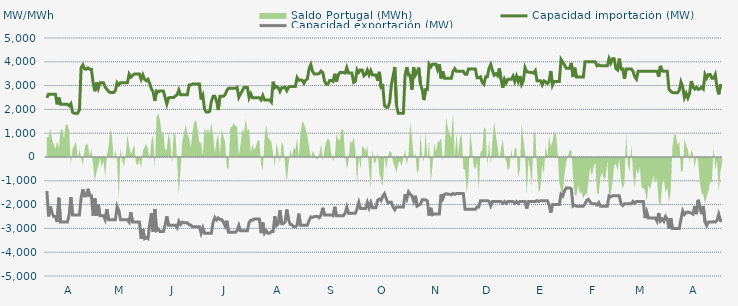
| Category | Capacidad importación (MW) | Capacidad exportación (MW) |
|---|---|---|
| 0 | 2487.5 | -1427.083 |
| 1900-01-01 | 2639.583 | -2495.833 |
| 1900-01-02 | 2633.333 | -2079.167 |
| 1900-01-03 | 2633.333 | -2350 |
| 1900-01-04 | 2633.333 | -2500 |
| 1900-01-05 | 2633.333 | -2500 |
| 1900-01-06 | 2212.5 | -2733.333 |
| 1900-01-07 | 2495.833 | -1712.5 |
| 1900-01-08 | 2212.5 | -2733.333 |
| 1900-01-09 | 2212.5 | -2725 |
| 1900-01-10 | 2212.5 | -2733.333 |
| 1900-01-11 | 2212.5 | -2733.333 |
| 1900-01-12 | 2212.5 | -2733.333 |
| 1900-01-13 | 2150 | -2433.333 |
| 1900-01-14 | 2241.667 | -1683.333 |
| 1900-01-15 | 1883.333 | -2433.333 |
| 1900-01-16 | 1837.5 | -2433.333 |
| 1900-01-17 | 1837.5 | -2433.333 |
| 1900-01-18 | 1837.5 | -2433.333 |
| 1900-01-19 | 1987.5 | -2433.333 |
| 1900-01-20 | 3754.167 | -1700 |
| 1900-01-21 | 3870.833 | -1362.5 |
| 1900-01-22 | 3704.167 | -1637.5 |
| 1900-01-23 | 3687.5 | -1633.333 |
| 1900-01-24 | 3743.75 | -1333.333 |
| 1900-01-25 | 3687.5 | -1633.333 |
| 1900-01-26 | 3687.5 | -1633.333 |
| 1900-01-27 | 3125 | -2466.667 |
| 1900-01-28 | 2762.5 | -1741.667 |
| 1900-01-29 | 3125 | -2466.667 |
| 1900-01-30 | 2881.25 | -1979.167 |
| 1900-01-31 | 3125 | -2466.667 |
| 1900-02-01 | 3125 | -2466.667 |
| 1900-02-02 | 3125 | -2466.667 |
| 1900-02-03 | 2941.667 | -2633.333 |
| 1900-02-04 | 2852.083 | -2187.5 |
| 1900-02-05 | 2752.083 | -2633.333 |
| 1900-02-06 | 2712.5 | -2633.333 |
| 1900-02-07 | 2712.5 | -2633.333 |
| 1900-02-08 | 2712.5 | -2633.333 |
| 1900-02-09 | 2795.833 | -2633.333 |
| 1900-02-10 | 3125 | -2079.583 |
| 1900-02-11 | 3029.167 | -2250 |
| 1900-02-12 | 3125 | -2633.333 |
| 1900-02-13 | 3125 | -2633.333 |
| 1900-02-14 | 3125 | -2633.333 |
| 1900-02-15 | 3125 | -2633.333 |
| 1900-02-16 | 3125 | -2633.333 |
| 1900-02-17 | 3483.333 | -2733.333 |
| 1900-02-18 | 3358.333 | -2320.833 |
| 1900-02-19 | 3429.167 | -2733.333 |
| 1900-02-20 | 3483.333 | -2733.333 |
| 1900-02-21 | 3483.333 | -2733.333 |
| 1900-02-22 | 3483.333 | -2733.333 |
| 1900-02-23 | 3483.333 | -2733.333 |
| 1900-02-24 | 3266.667 | -3433.333 |
| 1900-02-25 | 3454.167 | -3020.833 |
| 1900-02-26 | 3266.667 | -3433.333 |
| 1900-02-27 | 3204.167 | -3391.667 |
| 1900-02-28 | 3266.667 | -3433.333 |
| 1900-02-28 | 3083.333 | -2816.667 |
| 1900-03-01 | 2866.667 | -2362.5 |
| 1900-03-02 | 2737.5 | -3133.333 |
| 1900-03-03 | 2358.333 | -2183.333 |
| 1900-03-04 | 2775 | -3085.417 |
| 1900-03-05 | 2733.333 | -3029.167 |
| 1900-03-06 | 2775 | -3133.333 |
| 1900-03-07 | 2775 | -3133.333 |
| 1900-03-08 | 2775 | -3133.333 |
| 1900-03-09 | 2500 | -2866.667 |
| 1900-03-10 | 2225 | -2491.667 |
| 1900-03-11 | 2481.25 | -2866.667 |
| 1900-03-12 | 2500 | -2866.667 |
| 1900-03-13 | 2500 | -2866.667 |
| 1900-03-14 | 2500 | -2866.667 |
| 1900-03-15 | 2562.5 | -2866.667 |
| 1900-03-16 | 2612.5 | -2966.667 |
| 1900-03-17 | 2818.75 | -2704.167 |
| 1900-03-18 | 2612.5 | -2833.333 |
| 1900-03-19 | 2612.5 | -2737.5 |
| 1900-03-20 | 2612.5 | -2766.667 |
| 1900-03-21 | 2612.5 | -2766.667 |
| 1900-03-22 | 2612.5 | -2766.667 |
| 1900-03-23 | 3025 | -2850 |
| 1900-03-24 | 3029.167 | -2858.333 |
| 1900-03-25 | 3066.667 | -2933.333 |
| 1900-03-26 | 3066.667 | -2933.333 |
| 1900-03-27 | 3066.667 | -2933.333 |
| 1900-03-28 | 3066.667 | -2933.333 |
| 1900-03-29 | 3066.667 | -2933.333 |
| 1900-03-30 | 2416.667 | -3200 |
| 1900-03-31 | 2585.417 | -2975 |
| 1900-04-01 | 2012.5 | -3200 |
| 1900-04-02 | 1887.5 | -3200 |
| 1900-04-03 | 1887.5 | -3200 |
| 1900-04-04 | 1920.833 | -3200 |
| 1900-04-05 | 2333.333 | -3200 |
| 1900-04-06 | 2550 | -2733.333 |
| 1900-04-07 | 2550 | -2545.833 |
| 1900-04-08 | 2362.5 | -2645.833 |
| 1900-04-09 | 1975 | -2558.333 |
| 1900-04-10 | 2550 | -2629.167 |
| 1900-04-11 | 2550 | -2629.167 |
| 1900-04-12 | 2550 | -2729.167 |
| 1900-04-13 | 2616.667 | -2895.833 |
| 1900-04-14 | 2793.75 | -2679.167 |
| 1900-04-15 | 2887.5 | -3166.667 |
| 1900-04-16 | 2887.5 | -3166.667 |
| 1900-04-17 | 2887.5 | -3166.667 |
| 1900-04-18 | 2887.5 | -3166.667 |
| 1900-04-19 | 2887.5 | -3166.667 |
| 1900-04-20 | 2925 | -3100 |
| 1900-04-21 | 2512.5 | -2875 |
| 1900-04-22 | 2658.333 | -3100 |
| 1900-04-23 | 2779.167 | -3100 |
| 1900-04-24 | 2925 | -3100 |
| 1900-04-25 | 2925 | -3100 |
| 1900-04-26 | 2925 | -3100 |
| 1900-04-27 | 2487.5 | -2758.333 |
| 1900-04-28 | 2656.25 | -2658.333 |
| 1900-04-29 | 2487.5 | -2654.167 |
| 1900-04-30 | 2487.5 | -2600 |
| 1900-05-01 | 2487.5 | -2600 |
| 1900-05-02 | 2487.5 | -2600 |
| 1900-05-03 | 2487.5 | -2600 |
| 1900-05-04 | 2400 | -3200 |
| 1900-05-05 | 2583.333 | -2750 |
| 1900-05-06 | 2400 | -3200 |
| 1900-05-07 | 2400 | -3100 |
| 1900-05-08 | 2400 | -3200 |
| 1900-05-09 | 2400 | -3200 |
| 1900-05-10 | 2308.333 | -3133.333 |
| 1900-05-11 | 3162.5 | -3133.333 |
| 1900-05-12 | 2910.417 | -2495.833 |
| 1900-05-13 | 2962.5 | -2875 |
| 1900-05-14 | 2912.5 | -2800 |
| 1900-05-15 | 2752.083 | -2237.5 |
| 1900-05-16 | 2912.5 | -2800 |
| 1900-05-17 | 2912.5 | -2800 |
| 1900-05-18 | 2933.333 | -2733.333 |
| 1900-05-19 | 2787.5 | -2208.333 |
| 1900-05-20 | 2929.167 | -2633.333 |
| 1900-05-21 | 2962.5 | -2829.167 |
| 1900-05-22 | 2962.5 | -2850 |
| 1900-05-23 | 2962.5 | -2933.333 |
| 1900-05-24 | 2962.5 | -2933.333 |
| 1900-05-25 | 3337.5 | -2866.667 |
| 1900-05-26 | 3222.917 | -2379.167 |
| 1900-05-27 | 3237.5 | -2866.667 |
| 1900-05-28 | 3225 | -2866.667 |
| 1900-05-29 | 3095.833 | -2866.667 |
| 1900-05-30 | 3225 | -2866.667 |
| 1900-05-31 | 3281.25 | -2866.667 |
| 1900-06-01 | 3700 | -2666.667 |
| 1900-06-02 | 3883.333 | -2516.667 |
| 1900-06-03 | 3600 | -2537.5 |
| 1900-06-04 | 3487.5 | -2500 |
| 1900-06-05 | 3487.5 | -2500 |
| 1900-06-06 | 3487.5 | -2500 |
| 1900-06-07 | 3518.75 | -2550 |
| 1900-06-08 | 3612.5 | -2433.333 |
| 1900-06-09 | 3543.75 | -2133.333 |
| 1900-06-10 | 3193.75 | -2433.333 |
| 1900-06-11 | 3060.417 | -2433.333 |
| 1900-06-12 | 3059.167 | -2433.333 |
| 1900-06-13 | 3212.5 | -2433.333 |
| 1900-06-14 | 3212.5 | -2433.333 |
| 1900-06-15 | 3175 | -2466.667 |
| 1900-06-16 | 3495.833 | -2091.667 |
| 1900-06-17 | 3166.667 | -2466.667 |
| 1900-06-18 | 3454.167 | -2466.667 |
| 1900-06-19 | 3550 | -2466.667 |
| 1900-06-20 | 3550 | -2466.667 |
| 1900-06-21 | 3550 | -2466.667 |
| 1900-06-22 | 3525 | -2366.667 |
| 1900-06-23 | 3754.167 | -2104.167 |
| 1900-06-24 | 3525 | -2366.667 |
| 1900-06-25 | 3525 | -2366.667 |
| 1900-06-26 | 3525 | -2366.667 |
| 1900-06-27 | 3135 | -2366.667 |
| 1900-06-28 | 3175 | -2366.667 |
| 1900-06-29 | 3666.667 | -2166.667 |
| 1900-06-30 | 3558.333 | -1904.167 |
| 1900-07-01 | 3658.333 | -2166.667 |
| 1900-07-02 | 3650 | -2166.667 |
| 1900-07-03 | 3412.5 | -2166.667 |
| 1900-07-04 | 3475 | -2166.667 |
| 1900-07-05 | 3650 | -1904.167 |
| 1900-07-06 | 3450 | -2133.333 |
| 1900-07-07 | 3633.333 | -1912.5 |
| 1900-07-08 | 3450 | -2133.333 |
| 1900-07-09 | 3450 | -2133.333 |
| 1900-07-10 | 3450 | -2133.333 |
| 1900-07-11 | 3210.417 | -1816.667 |
| 1900-07-12 | 3577.083 | -1766.667 |
| 1900-07-13 | 2937.5 | -1833.333 |
| 1900-07-14 | 2985.417 | -1645.833 |
| 1900-07-15 | 2162.5 | -1541.667 |
| 1900-07-16 | 2087.5 | -1745.833 |
| 1900-07-17 | 2087.5 | -1929.167 |
| 1900-07-18 | 2295.833 | -1900 |
| 1900-07-19 | 3025 | -1900 |
| 1900-07-20 | 3395.833 | -2100 |
| 1900-07-21 | 3781.25 | -2212.5 |
| 1900-07-22 | 2170.833 | -2100 |
| 1900-07-23 | 1837.5 | -2100 |
| 1900-07-24 | 1837.5 | -2100 |
| 1900-07-25 | 1837.5 | -2100 |
| 1900-07-26 | 1837.5 | -2100 |
| 1900-07-27 | 3433.333 | -1566.667 |
| 1900-07-28 | 3776 | -1760 |
| 1900-07-29 | 3433.333 | -1466.667 |
| 1900-07-30 | 3433.333 | -1566.667 |
| 1900-07-31 | 2829.167 | -1633.333 |
| 1900-08-01 | 3766.667 | -1854.167 |
| 1900-08-02 | 3433.333 | -1629.167 |
| 1900-08-03 | 3562.5 | -2066.667 |
| 1900-08-04 | 3754.167 | -2029.167 |
| 1900-08-05 | 3064.583 | -1979.167 |
| 1900-08-06 | 2833.333 | -1800 |
| 1900-08-07 | 2391.667 | -1800 |
| 1900-08-08 | 2833.333 | -1800 |
| 1900-08-09 | 2833.333 | -1841.667 |
| 1900-08-10 | 3900 | -2466.667 |
| 1900-08-11 | 3787.5 | -2133.333 |
| 1900-08-12 | 3900 | -2429.167 |
| 1900-08-13 | 3900 | -2400 |
| 1900-08-14 | 3900 | -2400 |
| 1900-08-15 | 3668.75 | -2400 |
| 1900-08-16 | 3900 | -2400 |
| 1900-08-17 | 3304.167 | -1566.667 |
| 1900-08-18 | 3595.833 | -1754.167 |
| 1900-08-19 | 3304.167 | -1566.667 |
| 1900-08-20 | 3304.167 | -1541.667 |
| 1900-08-21 | 3304.167 | -1566.667 |
| 1900-08-22 | 3304.167 | -1566.667 |
| 1900-08-23 | 3304.167 | -1591.667 |
| 1900-08-24 | 3600 | -1533.333 |
| 1900-08-25 | 3712.5 | -1570.833 |
| 1900-08-26 | 3600 | -1533.333 |
| 1900-08-27 | 3600 | -1533.333 |
| 1900-08-28 | 3600 | -1533.333 |
| 1900-08-29 | 3600 | -1533.333 |
| 1900-08-30 | 3600 | -1533.333 |
| 1900-08-31 | 3475 | -2200 |
| 1900-09-01 | 3475 | -2200 |
| 1900-09-02 | 3700 | -2200 |
| 1900-09-03 | 3700 | -2200 |
| 1900-09-04 | 3700 | -2200 |
| 1900-09-05 | 3700 | -2200 |
| 1900-09-06 | 3700 | -2200 |
| 1900-09-07 | 3329.167 | -2095.833 |
| 1900-09-08 | 3329.167 | -2095.833 |
| 1900-09-09 | 3366.667 | -1833.333 |
| 1900-09-10 | 3141.667 | -1833.333 |
| 1900-09-11 | 3058.333 | -1833.333 |
| 1900-09-12 | 3366.667 | -1833.333 |
| 1900-09-13 | 3366.667 | -1833.333 |
| 1900-09-14 | 3725 | -1866.667 |
| 1900-09-15 | 3883.333 | -2054.167 |
| 1900-09-16 | 3631.25 | -1866.667 |
| 1900-09-17 | 3435.417 | -1866.667 |
| 1900-09-18 | 3495.833 | -1866.667 |
| 1900-09-19 | 3416.667 | -1866.667 |
| 1900-09-20 | 3725 | -1866.667 |
| 1900-09-21 | 3266.667 | -1866.667 |
| 1900-09-22 | 2912.5 | -1941.667 |
| 1900-09-23 | 3266.667 | -1866.667 |
| 1900-09-24 | 3116.667 | -1941.667 |
| 1900-09-25 | 3266.667 | -1866.667 |
| 1900-09-26 | 3266.667 | -1866.667 |
| 1900-09-27 | 3266.667 | -1866.667 |
| 1900-09-28 | 3400 | -1866.667 |
| 1900-09-29 | 3175 | -1941.667 |
| 1900-09-30 | 3400 | -1866.667 |
| 1900-10-01 | 3175 | -1941.667 |
| 1900-10-02 | 3400 | -1866.667 |
| 1900-10-03 | 3047.917 | -1866.667 |
| 1900-10-04 | 3200 | -1866.667 |
| 1900-10-05 | 3754.167 | -1866.667 |
| 1900-10-06 | 3581.25 | -2166.667 |
| 1900-10-07 | 3566.667 | -1866.667 |
| 1900-10-08 | 3554.167 | -1866.667 |
| 1900-10-09 | 3554.167 | -1866.667 |
| 1900-10-10 | 3525 | -1866.667 |
| 1900-10-11 | 3629.167 | -1866.667 |
| 1900-10-12 | 3200 | -1833.333 |
| 1900-10-13 | 3200 | -1870.833 |
| 1900-10-14 | 3200 | -1833.333 |
| 1900-10-15 | 3031.25 | -1833.333 |
| 1900-10-16 | 3200 | -1833.333 |
| 1900-10-17 | 3162.5 | -1833.333 |
| 1900-10-18 | 3083.333 | -1833.333 |
| 1900-10-19 | 3175 | -2000 |
| 1900-10-20 | 3608.333 | -2337.5 |
| 1900-10-21 | 3016.667 | -2000 |
| 1900-10-22 | 3175 | -2000 |
| 1900-10-23 | 3175 | -2000 |
| 1900-10-24 | 3175 | -2000 |
| 1900-10-25 | 3175 | -2000 |
| 1900-10-26 | 4100 | -1566.667 |
| 1900-10-27 | 3987.5 | -1641.667 |
| 1900-10-28 | 3864.583 | -1425 |
| 1900-10-29 | 3733.333 | -1300 |
| 1900-10-30 | 3733.333 | -1300 |
| 1900-10-31 | 3733.333 | -1300 |
| 1900-11-01 | 3952.083 | -1341.667 |
| 1900-11-02 | 3362.5 | -2066.667 |
| 1900-11-03 | 3752.083 | -2029.167 |
| 1900-11-04 | 3362.5 | -2066.667 |
| 1900-11-05 | 3362.5 | -2066.667 |
| 1900-11-06 | 3362.5 | -2066.667 |
| 1900-11-07 | 3362.5 | -2066.667 |
| 1900-11-08 | 3362.5 | -2066.667 |
| 1900-11-09 | 4000 | -1966.667 |
| 1900-11-10 | 4000 | -1816.667 |
| 1900-11-11 | 4000 | -1779.167 |
| 1900-11-12 | 4000 | -1891.667 |
| 1900-11-13 | 4000 | -1966.667 |
| 1900-11-14 | 4000 | -1966.667 |
| 1900-11-15 | 4000 | -1966.667 |
| 1900-11-16 | 3829.167 | -2016.667 |
| 1900-11-17 | 3870.833 | -1916.667 |
| 1900-11-18 | 3829.167 | -2066.667 |
| 1900-11-19 | 3829.167 | -2066.667 |
| 1900-11-20 | 3829.167 | -2066.667 |
| 1900-11-21 | 3829.167 | -2066.667 |
| 1900-11-22 | 3829.167 | -2066.667 |
| 1900-11-23 | 4133.333 | -1633.333 |
| 1900-11-24 | 3945.833 | -1670.833 |
| 1900-11-25 | 4133.333 | -1633.333 |
| 1900-11-26 | 4133.333 | -1633.333 |
| 1900-11-27 | 3716.667 | -1633.333 |
| 1900-11-28 | 3658.333 | -1633.333 |
| 1900-11-29 | 4133.333 | -1633.333 |
| 1900-11-30 | 3700 | -1966.667 |
| 1900-12-01 | 3700 | -2041.667 |
| 1900-12-02 | 3283.333 | -1966.667 |
| 1900-12-03 | 3700 | -1966.667 |
| 1900-12-04 | 3700 | -1966.667 |
| 1900-12-05 | 3700 | -1966.667 |
| 1900-12-06 | 3700 | -1966.667 |
| 1900-12-07 | 3600 | -1866.667 |
| 1900-12-08 | 3375 | -1941.667 |
| 1900-12-09 | 3270.833 | -1866.667 |
| 1900-12-10 | 3600 | -1866.667 |
| 1900-12-11 | 3600 | -1866.667 |
| 1900-12-12 | 3600 | -1866.667 |
| 1900-12-13 | 3600 | -1866.667 |
| 1900-12-14 | 3600 | -2566.667 |
| 1900-12-15 | 3600 | -2304.167 |
| 1900-12-16 | 3600 | -2566.667 |
| 1900-12-17 | 3600 | -2566.667 |
| 1900-12-18 | 3600 | -2566.667 |
| 1900-12-19 | 3600 | -2566.667 |
| 1900-12-20 | 3600 | -2566.667 |
| 1900-12-21 | 3600 | -2700 |
| 1900-12-22 | 3375 | -2362.5 |
| 1900-12-23 | 3829.167 | -2687.5 |
| 1900-12-24 | 3616.667 | -2600 |
| 1900-12-25 | 3600 | -2700 |
| 1900-12-26 | 3600 | -2500 |
| 1900-12-27 | 3600 | -2612.5 |
| 1900-12-28 | 2833.333 | -3000 |
| 1900-12-29 | 2760.87 | -2565.217 |
| 1900-12-30 | 2708.333 | -3000 |
| 1900-12-31 | 2700 | -3000 |
| 1901-01-01 | 2700 | -3000 |
| 1901-01-02 | 2700 | -3000 |
| 1901-01-03 | 2800 | -3000 |
| 1901-01-04 | 3150 | -2600 |
| 1901-01-05 | 2945.833 | -2262.5 |
| 1901-01-06 | 2495.833 | -2412.5 |
| 1901-01-07 | 2675 | -2333.333 |
| 1901-01-08 | 2479.167 | -2308.333 |
| 1901-01-09 | 2675 | -2333.333 |
| 1901-01-10 | 3191.667 | -2358.333 |
| 1901-01-11 | 2933.333 | -2400 |
| 1901-01-12 | 2858.333 | -2062.5 |
| 1901-01-13 | 2933.333 | -2400 |
| 1901-01-14 | 2839.583 | -1800 |
| 1901-01-15 | 2864.583 | -2091.667 |
| 1901-01-16 | 2933.333 | -2400 |
| 1901-01-17 | 2858.333 | -2062.5 |
| 1901-01-18 | 3466.667 | -2733.333 |
| 1901-01-19 | 3316.667 | -2883.333 |
| 1901-01-20 | 3466.667 | -2733.333 |
| 1901-01-21 | 3466.667 | -2733.333 |
| 1901-01-22 | 3310.417 | -2733.333 |
| 1901-01-23 | 3306.25 | -2716.667 |
| 1901-01-24 | 3466.667 | -2733.333 |
| 1901-01-25 | 2933.333 | -2666.667 |
| 1901-01-26 | 2633.333 | -2404.167 |
| 1901-01-27 | 3000 | -2666.667 |
| 1901-01-28 | 3000 | -2666.667 |